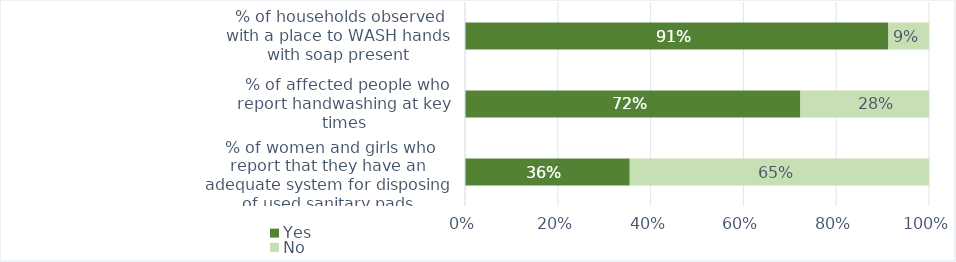
| Category | Yes | No |
|---|---|---|
|  % of women and girls who report that they have an adequate system for disposing of used sanitary pads | 0.355 | 0.645 |
|  % of affected people who report handwashing at key times | 0.723 | 0.277 |
|  % of households observed with a place to WASH hands with soap present | 0.913 | 0.087 |